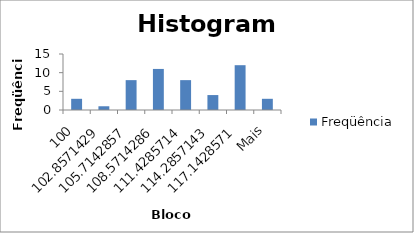
| Category | Freqüência |
|---|---|
| 100 | 3 |
| 102,8571429 | 1 |
| 105,7142857 | 8 |
| 108,5714286 | 11 |
| 111,4285714 | 8 |
| 114,2857143 | 4 |
| 117,1428571 | 12 |
| Mais | 3 |